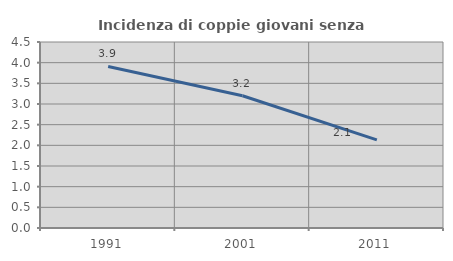
| Category | Incidenza di coppie giovani senza figli |
|---|---|
| 1991.0 | 3.908 |
| 2001.0 | 3.199 |
| 2011.0 | 2.133 |